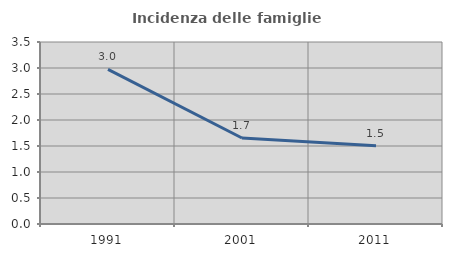
| Category | Incidenza delle famiglie numerose |
|---|---|
| 1991.0 | 2.973 |
| 2001.0 | 1.654 |
| 2011.0 | 1.503 |